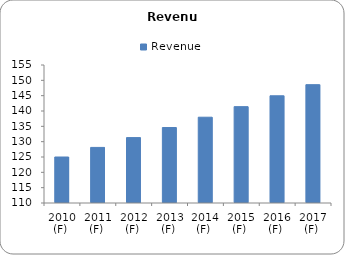
| Category | Revenue |
|---|---|
| 2010 (F)  | 125 |
| 2011 (F)  | 128.125 |
| 2012 (F)  | 131.328 |
| 2013 (F)  | 134.611 |
| 2014 (F)  | 137.977 |
| 2015 (F)  | 141.426 |
| 2016 (F)  | 144.962 |
| 2017 (F)  | 148.586 |